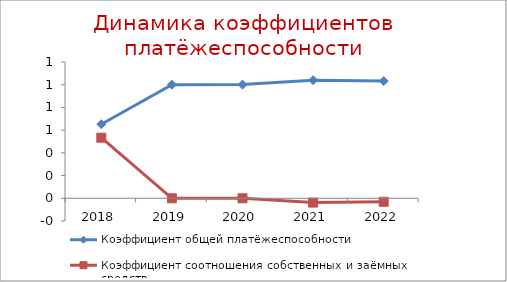
| Category | Коэффициент общей платёжеспособности | Коэффициент соотношения собственных и заёмных средств |
|---|---|---|
| 2018.0 | 0.652 | 0.533 |
| 2019.0 | 1 | 0 |
| 2020.0 | 1.001 | 0 |
| 2021.0 | 1.04 | -0.038 |
| 2022.0 | 1.032 | -0.031 |